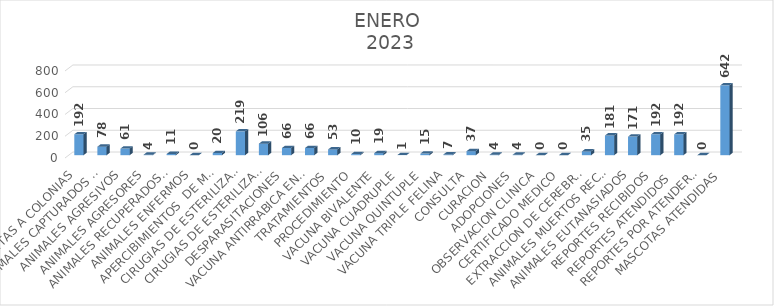
| Category | Series 0 |
|---|---|
| VISITAS A COLONIAS | 192 |
| ANIMALES CAPTURADOS PERROS Y GATOS  | 78 |
| ANIMALES AGRESIVOS | 61 |
| ANIMALES AGRESORES | 4 |
| ANIMALES RECUPERADOS POR SUS DUEÑOS | 11 |
| ANIMALES ENFERMOS | 0 |
| APERCIBIMIENTOS  DE MALTRATO ANIMAL | 20 |
| CIRUGIAS DE ESTERILIZACION (OVH) hembra | 219 |
| CIRUGIAS DE ESTERILIZACION (ORQ) macho | 106 |
| DESPARASITACIONES | 66 |
| VACUNA ANTIRRABICA EN OFICINA Y CAMPAÑAS PASEOS DEL PRADO Y FOVISSSTE MIRAVALLE | 66 |
| TRATAMIENTOS | 53 |
| PROCEDIMIENTO | 10 |
| VACUNA BIVALENTE | 19 |
| VACUNA CUADRUPLE | 1 |
| VACUNA QUINTUPLE | 15 |
| VACUNA TRIPLE FELINA | 7 |
| CONSULTA | 37 |
| CURACION | 4 |
| ADOPCIONES | 4 |
| OBSERVACION CLINICA | 0 |
| CERTIFICADO MEDICO | 0 |
| EXTRACCION DE CEREBROS | 35 |
| ANIMALES MUERTOS RECOLECTADOS | 181 |
| ANIMALES EUTANASIADOS | 171 |
| REPORTES RECIBIDOS | 192 |
| REPORTES ATENDIDOS  | 192 |
| REPORTES POR ATENDER (PENDIENTES) | 0 |
| MASCOTAS ATENDIDAS | 642 |